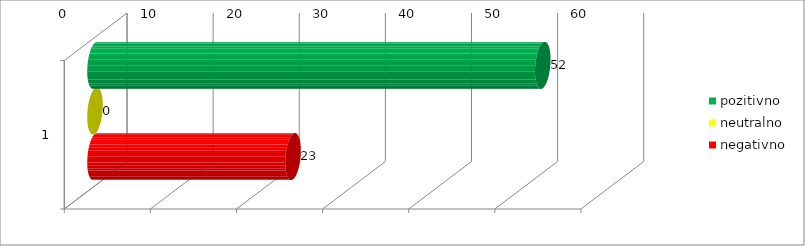
| Category | pozitivno | neutralno | negativno |
|---|---|---|---|
| 0 | 52 | 0 | 23 |